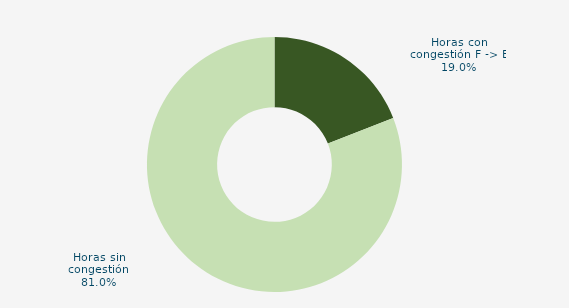
| Category | Horas con congestión E -> F |
|---|---|
| Horas con congestión E -> F | 0 |
| Horas con congestión F -> E | 11.828 |
| Horas sin congestión | 50.269 |